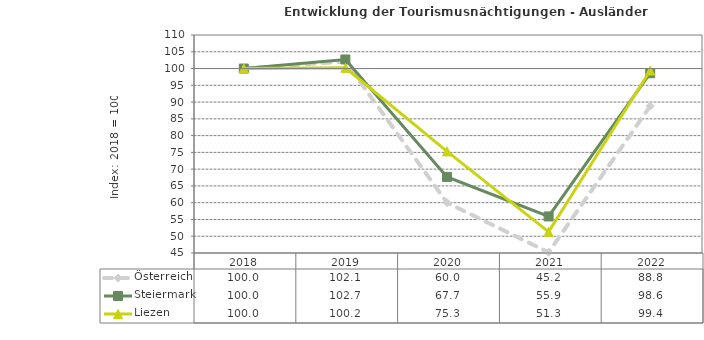
| Category | Österreich | Steiermark | Liezen |
|---|---|---|---|
| 2022.0 | 88.8 | 98.6 | 99.4 |
| 2021.0 | 45.2 | 55.9 | 51.3 |
| 2020.0 | 60 | 67.7 | 75.3 |
| 2019.0 | 102.1 | 102.7 | 100.2 |
| 2018.0 | 100 | 100 | 100 |